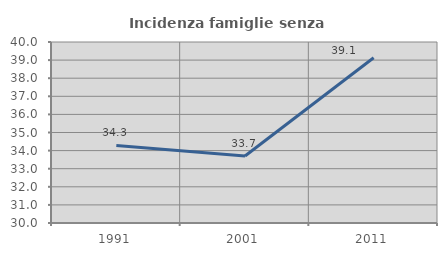
| Category | Incidenza famiglie senza nuclei |
|---|---|
| 1991.0 | 34.284 |
| 2001.0 | 33.698 |
| 2011.0 | 39.13 |